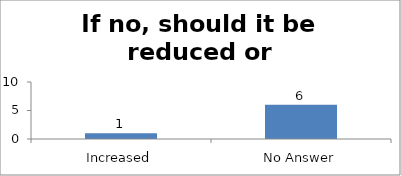
| Category | If no, should it be reduced or increased |
|---|---|
| Increased | 1 |
| No Answer | 6 |